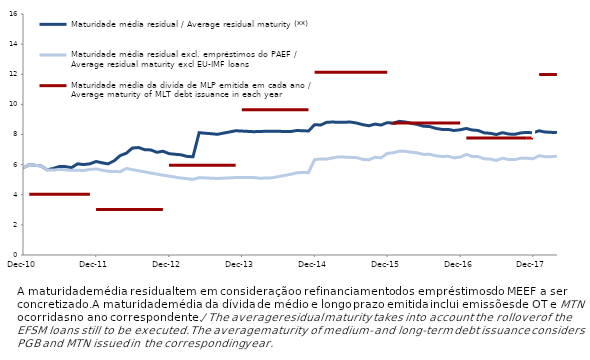
| Category | Maturidade média residual / Average residual maturity (**) | Maturidade média residual excl. empréstimos do PAEF / Average residual maturity excl EU-IMF loans | Maturidade média da dívida de MLP emitida em cada ano / Average maturity of MLT debt issuance in each year |
|---|---|---|---|
| 2010-12-31 | 5.779 | 5.779 | 7.35 |
| 2011-01-31 | 5.995 | 5.995 | 4.039 |
| 2011-02-28 | 5.958 | 5.958 | 4.039 |
| 2011-03-31 | 5.915 | 5.915 | 4.039 |
| 2011-04-30 | 5.658 | 5.658 | 4.039 |
| 2011-05-31 | 5.743 | 5.633 | 4.039 |
| 2011-06-30 | 5.873 | 5.683 | 4.039 |
| 2011-07-31 | 5.868 | 5.651 | 4.039 |
| 2011-08-31 | 5.799 | 5.619 | 4.039 |
| 2011-09-30 | 6.05 | 5.622 | 4.039 |
| 2011-10-31 | 6.006 | 5.614 | 4.039 |
| 2011-11-01 | 6.019 | 5.605 | 4.039 |
| 2011-12-01 | 6.054 | 5.68 | 4.039 |
| 2012-01-01 | 6.208 | 5.715 | 3.017 |
| 2012-02-01 | 6.118 | 5.626 | 3.017 |
| 2012-03-01 | 6.05 | 5.556 | 3.017 |
| 2012-04-01 | 6.257 | 5.545 | 3.017 |
| 2012-05-01 | 6.601 | 5.53 | 3.017 |
| 2012-06-01 | 6.759 | 5.743 | 3.017 |
| 2012-07-01 | 7.101 | 5.667 | 3.017 |
| 2012-08-01 | 7.134 | 5.591 | 3.017 |
| 2012-09-01 | 6.99 | 5.516 | 3.017 |
| 2012-10-01 | 6.976 | 5.444 | 3.017 |
| 2012-11-01 | 6.816 | 5.372 | 3.017 |
| 2012-12-01 | 6.889 | 5.301 | 3.017 |
| 2013-01-01 | 6.729 | 5.237 | 5.956 |
| 2013-02-01 | 6.685 | 5.173 | 5.956 |
| 2013-03-01 | 6.656 | 5.11 | 5.956 |
| 2013-04-01 | 6.546 | 5.066 | 5.956 |
| 2013-05-01 | 6.52 | 5.023 | 5.956 |
| 2013-06-01 | 8.123 | 5.136 | 5.956 |
| 2013-07-01 | 8.087 | 5.118 | 5.956 |
| 2013-08-01 | 8.05 | 5.099 | 5.956 |
| 2013-09-01 | 8.013 | 5.08 | 5.956 |
| 2013-10-01 | 8.092 | 5.101 | 5.956 |
| 2013-11-01 | 8.17 | 5.122 | 5.956 |
| 2013-12-01 | 8.249 | 5.143 | 5.956 |
| 2014-01-01 | 8.228 | 5.145 | 9.636 |
| 2014-02-01 | 8.207 | 5.146 | 9.636 |
| 2014-03-01 | 8.186 | 5.148 | 9.636 |
| 2014-04-01 | 8.202 | 5.096 | 9.636 |
| 2014-05-01 | 8.212 | 5.109 | 9.636 |
| 2014-06-01 | 8.222 | 5.122 | 9.636 |
| 2014-07-01 | 8.212 | 5.199 | 9.636 |
| 2014-08-01 | 8.202 | 5.276 | 9.636 |
| 2014-09-01 | 8.192 | 5.353 | 9.636 |
| 2014-10-01 | 8.26 | 5.449 | 9.636 |
| 2014-11-01 | 8.254 | 5.483 | 9.636 |
| 2014-12-01 | 8.23 | 5.465 | 9.636 |
| 2015-01-01 | 8.652 | 6.332 | 12.125 |
| 2015-02-01 | 8.629 | 6.378 | 12.125 |
| 2015-03-01 | 8.804 | 6.362 | 12.125 |
| 2015-04-01 | 8.83 | 6.446 | 12.125 |
| 2015-05-01 | 8.806 | 6.513 | 12.125 |
| 2015-06-30 | 8.826 | 6.484 | 12.125 |
| 2015-07-31 | 8.759 | 6.462 | 12.125 |
| 2015-08-31 | 8.65 | 6.348 | 12.125 |
| 2015-09-30 | 8.581 | 6.322 | 12.125 |
| 2015-10-31 | 8.692 | 6.487 | 12.125 |
| 2015-11-30 | 8.628 | 6.453 | 12.125 |
| 2015-12-31 | 8.786 | 6.742 | 12.125 |
| 2016-01-31 | 8.756 | 6.787 | 8.755 |
| 2016-02-29 | 8.874 | 6.893 | 8.755 |
| 2016-03-31 | 8.83 | 6.879 | 8.755 |
| 2016-04-30 | 8.741 | 6.823 | 8.755 |
| 2016-05-31 | 8.664 | 6.779 | 8.755 |
| 2016-06-30 | 8.55 | 6.675 | 8.755 |
| 2016-07-31 | 8.527 | 6.691 | 8.755 |
| 2016-08-31 | 8.405 | 6.585 | 8.755 |
| 2016-09-30 | 8.339 | 6.539 | 8.755 |
| 2016-10-31 | 8.339 | 6.56 | 8.755 |
| 2016-11-30 | 8.264 | 6.447 | 8.755 |
| 2016-12-31 | 8.314 | 6.501 | 8.755 |
| 2017-01-31 | 8.4 | 6.682 | 7.766 |
| 2017-02-28 | 8.3 | 6.547 | 7.766 |
| 2017-03-31 | 8.268 | 6.53 | 7.766 |
| 2017-04-30 | 8.111 | 6.385 | 7.766 |
| 2017-05-31 | 8.08 | 6.371 | 7.766 |
| 2017-06-30 | 7.997 | 6.275 | 7.766 |
| 2017-07-31 | 8.121 | 6.43 | 7.766 |
| 2017-08-31 | 8.031 | 6.335 | 7.766 |
| 2017-09-30 | 8.012 | 6.334 | 7.766 |
| 2017-10-31 | 8.105 | 6.43 | 7.766 |
| 2017-11-30 | 8.141 | 6.425 | 7.766 |
| 2017-12-31 | 8.111 | 6.39 | 7.766 |
| 2018-01-31 | 8.247 | 6.591 | 11.981 |
| 2018-02-28 | 8.168 | 6.526 | 11.981 |
| 2018-03-31 | 8.144 | 6.526 | 11.981 |
| 2018-04-30 | 8.126 | 6.565 | 11.981 |